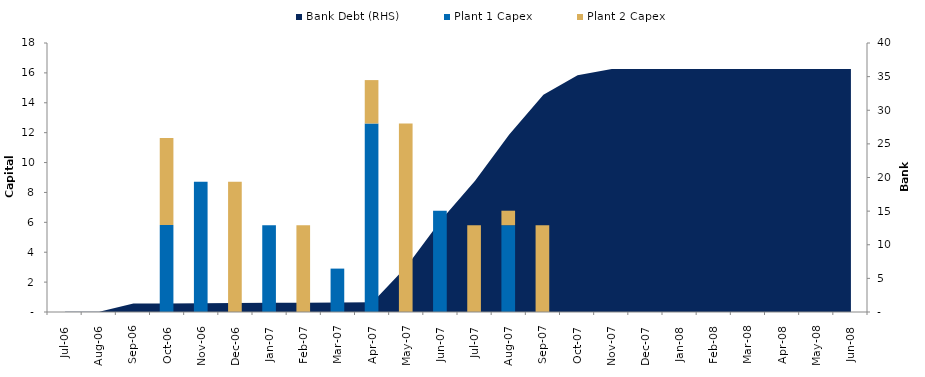
| Category | Plant 1 Capex | Plant 2 Capex |
|---|---|---|
| Jul-06  | 0 | 0 |
| Aug-06  | 0 | 0 |
| Sep-06  | 0 | 0 |
| Oct-06  | 5.822 | 5.822 |
| Nov-06  | 8.712 | 0 |
| Dec-06  | 0 | 8.712 |
| Jan-07  | 5.808 | 0 |
| Feb-07  | 0 | 5.808 |
| Mar-07  | 2.904 | 0 |
| Apr-07  | 12.614 | 2.904 |
| May-07  | 0 | 12.614 |
| Jun-07  | 6.778 | 0 |
| Jul-07  | 0 | 5.808 |
| Aug-07  | 5.808 | 0.97 |
| Sep-07  | 0 | 5.808 |
| Oct-07  | 0 | 0 |
| Nov-07  | 0 | 0 |
| Dec-07  | 0 | 0 |
| Jan-08  | 0 | 0 |
| Feb-08  | 0 | 0 |
| Mar-08  | 0 | 0 |
| Apr-08  | 0 | 0 |
| May-08  | 0 | 0 |
| Jun-08  | 0 | 0 |